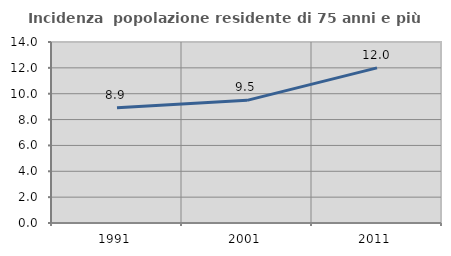
| Category | Incidenza  popolazione residente di 75 anni e più |
|---|---|
| 1991.0 | 8.912 |
| 2001.0 | 9.487 |
| 2011.0 | 11.995 |